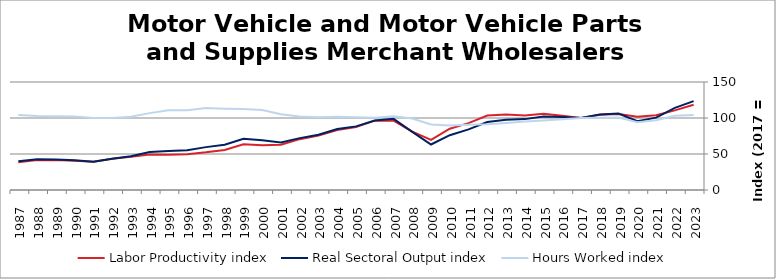
| Category | Labor Productivity index | Real Sectoral Output index | Hours Worked index |
|---|---|---|---|
| 2023.0 | 118.496 | 123.515 | 104.236 |
| 2022.0 | 110.631 | 113.981 | 103.027 |
| 2021.0 | 103.89 | 100.506 | 96.743 |
| 2020.0 | 101.8 | 95.667 | 93.975 |
| 2019.0 | 105.538 | 106.089 | 100.522 |
| 2018.0 | 104.451 | 104.951 | 100.479 |
| 2017.0 | 100 | 100 | 100 |
| 2016.0 | 103.185 | 101.419 | 98.288 |
| 2015.0 | 105.775 | 102.202 | 96.622 |
| 2014.0 | 103.379 | 98.443 | 95.226 |
| 2013.0 | 104.83 | 97.646 | 93.147 |
| 2012.0 | 103.489 | 94.444 | 91.259 |
| 2011.0 | 92.895 | 84.145 | 90.581 |
| 2010.0 | 85.141 | 76.141 | 89.43 |
| 2009.0 | 69.546 | 63.209 | 90.888 |
| 2008.0 | 81.166 | 80.685 | 99.408 |
| 2007.0 | 96.484 | 98.857 | 102.46 |
| 2006.0 | 96.302 | 96.517 | 100.224 |
| 2005.0 | 87.317 | 88.359 | 101.193 |
| 2004.0 | 83.238 | 84.77 | 101.84 |
| 2003.0 | 75.731 | 76.633 | 101.192 |
| 2002.0 | 70.61 | 72.034 | 102.017 |
| 2001.0 | 62.739 | 66.086 | 105.334 |
| 2000.0 | 62.047 | 68.934 | 111.101 |
| 1999.0 | 63.379 | 71.252 | 112.423 |
| 1998.0 | 55.652 | 62.824 | 112.887 |
| 1997.0 | 52.346 | 59.55 | 113.761 |
| 1996.0 | 49.804 | 55.184 | 110.802 |
| 1995.0 | 48.954 | 54.211 | 110.738 |
| 1994.0 | 49.41 | 52.764 | 106.789 |
| 1993.0 | 46.097 | 46.929 | 101.804 |
| 1992.0 | 43.556 | 43.526 | 99.93 |
| 1991.0 | 39.241 | 39.263 | 100.057 |
| 1990.0 | 40.57 | 41.484 | 102.253 |
| 1989.0 | 41.542 | 42.527 | 102.373 |
| 1988.0 | 41.486 | 42.601 | 102.687 |
| 1987.0 | 38.387 | 39.939 | 104.043 |